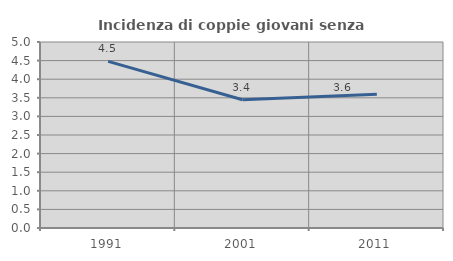
| Category | Incidenza di coppie giovani senza figli |
|---|---|
| 1991.0 | 4.479 |
| 2001.0 | 3.448 |
| 2011.0 | 3.592 |